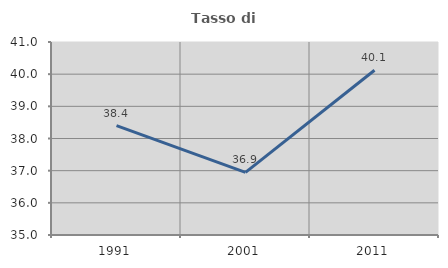
| Category | Tasso di occupazione   |
|---|---|
| 1991.0 | 38.403 |
| 2001.0 | 36.945 |
| 2011.0 | 40.123 |